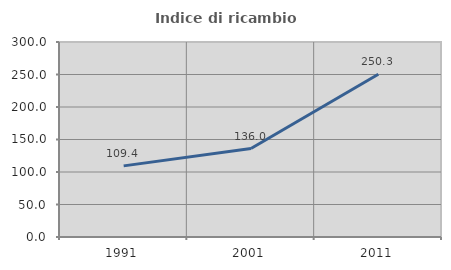
| Category | Indice di ricambio occupazionale  |
|---|---|
| 1991.0 | 109.422 |
| 2001.0 | 136.049 |
| 2011.0 | 250.339 |